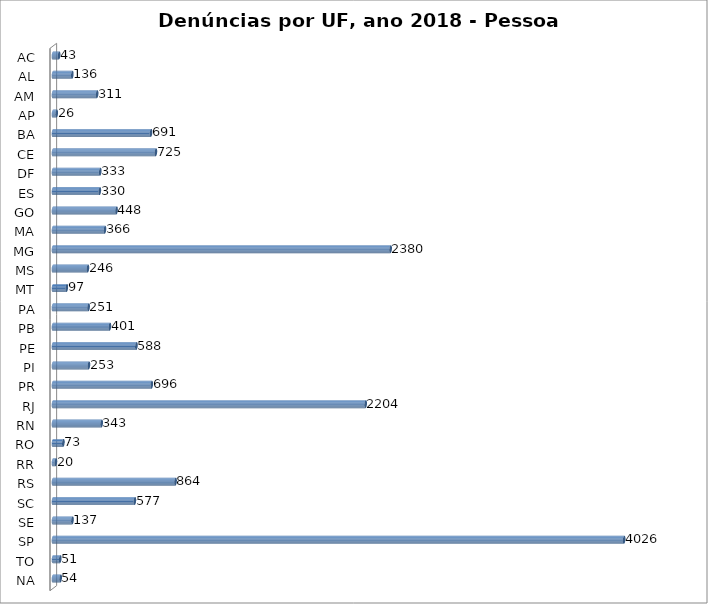
| Category | Series 0 |
|---|---|
| AC | 43 |
| AL | 136 |
| AM | 311 |
| AP | 26 |
| BA | 691 |
| CE | 725 |
| DF | 333 |
| ES | 330 |
| GO | 448 |
| MA | 366 |
| MG | 2380 |
| MS | 246 |
| MT | 97 |
| PA | 251 |
| PB | 401 |
| PE | 588 |
| PI | 253 |
| PR | 696 |
| RJ | 2204 |
| RN | 343 |
| RO | 73 |
| RR | 20 |
| RS | 864 |
| SC | 577 |
| SE | 137 |
| SP | 4026 |
| TO | 51 |
| NA | 54 |